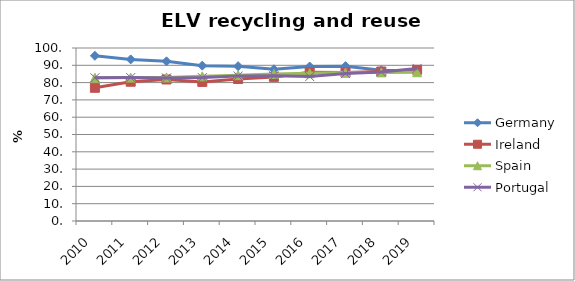
| Category | Germany | Ireland | Spain | Portugal |
|---|---|---|---|---|
| 2010 | 95.5 | 77 | 82.8 | 82.8 |
| 2011 | 93.4 | 80.5 | 82.9 | 82.9 |
| 2012 | 92.3 | 81.8 | 83 | 82.7 |
| 2013 | 89.8 | 80.4 | 83.6 | 82.9 |
| 2014 | 89.5 | 82.1 | 84.3 | 83.8 |
| 2015 | 87.7 | 83.3 | 85 | 84 |
| 2016 | 89.3 | 86 | 85.4 | 83.5 |
| 2017 | 89.5 | 85.9 | 85.8 | 85.2 |
| 2018 | 87.1 | 86.4 | 85.9 | 86.1 |
| 2019 | 86.9 | 87.4 | 86 | 88.2 |